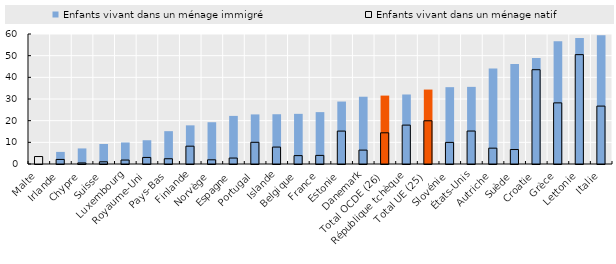
| Category | Enfants vivant dans un ménage immigré | Enfants vivant dans un ménage natif |
|---|---|---|
| Malte | 0 | 3.446 |
| Irlande | 5.585 | 2.11 |
| Chypre | 7.188 | 0.497 |
| Suisse | 9.231 | 1.011 |
| Luxembourg | 9.943 | 1.828 |
| Royaume-Uni | 10.965 | 3.027 |
| Pays-Bas | 15.154 | 2.426 |
| Finlande | 17.836 | 8.225 |
| Norvège | 19.278 | 1.933 |
| Espagne | 22.202 | 2.743 |
| Portugal | 22.887 | 10.014 |
| Islande | 22.968 | 7.813 |
| Belgique | 23.148 | 3.869 |
| France | 23.942 | 3.972 |
| Estonie | 28.823 | 15.19 |
| Danemark | 31.051 | 6.411 |
| Total OCDE (26) | 31.57 | 14.396 |
| République tchèque | 32.083 | 17.952 |
| Total UE (25) | 34.355 | 19.943 |
| Slovénie | 35.461 | 9.972 |
| États-Unis | 35.6 | 15.21 |
| Autriche | 44.073 | 7.31 |
| Suède | 46.159 | 6.685 |
| Croatie | 48.971 | 43.515 |
| Grèce | 56.685 | 28.217 |
| Lettonie | 58.182 | 50.474 |
| Italie | 59.382 | 26.719 |